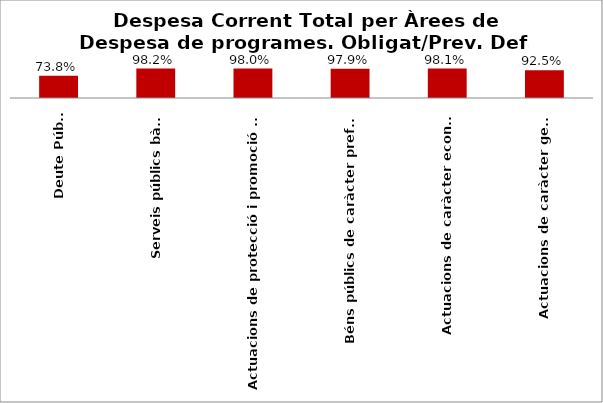
| Category | Series 0 |
|---|---|
| Deute Públic | 0.738 |
| Serveis públics bàsics | 0.982 |
| Actuacions de protecció i promoció social | 0.98 |
| Béns públics de caràcter preferent | 0.979 |
| Actuacions de caràcter econòmic | 0.981 |
| Actuacions de caràcter general | 0.925 |